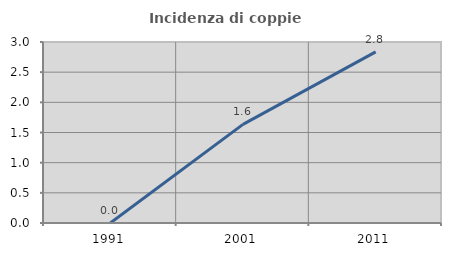
| Category | Incidenza di coppie miste |
|---|---|
| 1991.0 | 0 |
| 2001.0 | 1.635 |
| 2011.0 | 2.837 |